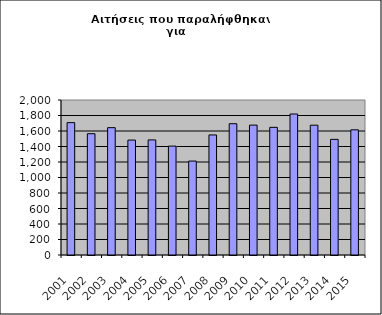
| Category | Series 0 |
|---|---|
| 2001.0 | 1708 |
| 2002.0 | 1565 |
| 2003.0 | 1643 |
| 2004.0 | 1483 |
| 2005.0 | 1485 |
| 2006.0 | 1405 |
| 2007.0 | 1212 |
| 2008.0 | 1549 |
| 2009.0 | 1694 |
| 2010.0 | 1676 |
| 2011.0 | 1647 |
| 2012.0 | 1819 |
| 2013.0 | 1675 |
| 2014.0 | 1492 |
| 2015.0 | 1615 |